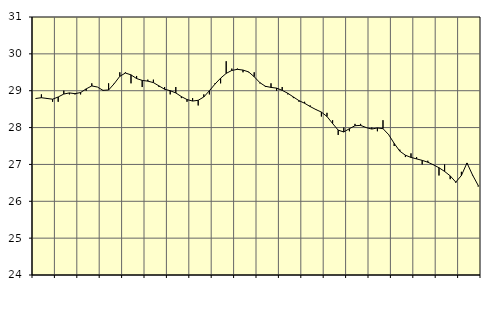
| Category | Piggar | Series 1 |
|---|---|---|
| nan | 28.8 | 28.79 |
| 1.0 | 28.9 | 28.81 |
| 1.0 | 28.8 | 28.79 |
| 1.0 | 28.7 | 28.77 |
| nan | 28.7 | 28.83 |
| 2.0 | 29 | 28.91 |
| 2.0 | 28.9 | 28.94 |
| 2.0 | 28.9 | 28.92 |
| nan | 28.9 | 28.95 |
| 3.0 | 29 | 29.05 |
| 3.0 | 29.2 | 29.13 |
| 3.0 | 29.1 | 29.1 |
| nan | 29 | 29.01 |
| 4.0 | 29.2 | 29.02 |
| 4.0 | 29.2 | 29.19 |
| 4.0 | 29.5 | 29.39 |
| nan | 29.5 | 29.48 |
| 5.0 | 29.2 | 29.43 |
| 5.0 | 29.4 | 29.33 |
| 5.0 | 29.1 | 29.28 |
| nan | 29.3 | 29.26 |
| 6.0 | 29.3 | 29.22 |
| 6.0 | 29.1 | 29.13 |
| 6.0 | 29.1 | 29.04 |
| nan | 28.9 | 29 |
| 7.0 | 29.1 | 28.94 |
| 7.0 | 28.8 | 28.84 |
| 7.0 | 28.7 | 28.76 |
| nan | 28.8 | 28.72 |
| 8.0 | 28.6 | 28.74 |
| 8.0 | 28.9 | 28.83 |
| 8.0 | 28.9 | 29 |
| nan | 29.2 | 29.18 |
| 9.0 | 29.2 | 29.34 |
| 9.0 | 29.8 | 29.47 |
| 9.0 | 29.6 | 29.55 |
| nan | 29.6 | 29.58 |
| 10.0 | 29.5 | 29.56 |
| 10.0 | 29.5 | 29.51 |
| 10.0 | 29.5 | 29.38 |
| nan | 29.2 | 29.22 |
| 11.0 | 29.1 | 29.12 |
| 11.0 | 29.2 | 29.09 |
| 11.0 | 29 | 29.07 |
| nan | 29.1 | 29.01 |
| 12.0 | 28.9 | 28.93 |
| 12.0 | 28.8 | 28.83 |
| 12.0 | 28.7 | 28.73 |
| nan | 28.7 | 28.66 |
| 13.0 | 28.6 | 28.57 |
| 13.0 | 28.5 | 28.49 |
| 13.0 | 28.3 | 28.42 |
| nan | 28.4 | 28.3 |
| 14.0 | 28.2 | 28.11 |
| 14.0 | 27.8 | 27.93 |
| 14.0 | 28 | 27.88 |
| nan | 27.9 | 27.97 |
| 15.0 | 28.1 | 28.05 |
| 15.0 | 28.1 | 28.06 |
| 15.0 | 28 | 28 |
| nan | 28 | 27.96 |
| 16.0 | 27.9 | 27.99 |
| 16.0 | 28.2 | 27.97 |
| 16.0 | 27.8 | 27.81 |
| nan | 27.5 | 27.57 |
| 17.0 | 27.4 | 27.36 |
| 17.0 | 27.2 | 27.25 |
| 17.0 | 27.3 | 27.19 |
| nan | 27.2 | 27.15 |
| 18.0 | 27 | 27.11 |
| 18.0 | 27.1 | 27.06 |
| 18.0 | 27 | 26.99 |
| nan | 26.7 | 26.91 |
| 19.0 | 27 | 26.81 |
| 19.0 | 26.6 | 26.69 |
| 19.0 | 26.5 | 26.52 |
| nan | 26.8 | 26.7 |
| 20.0 | 27 | 27.04 |
| 20.0 | 26.7 | 26.71 |
| 20.0 | 26.4 | 26.43 |